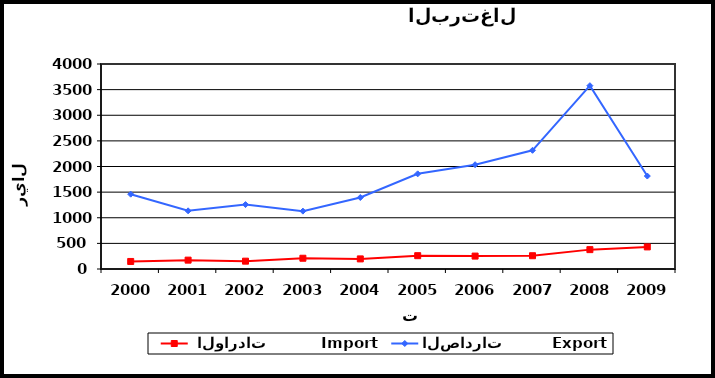
| Category |  الواردات           Import | الصادرات          Export |
|---|---|---|
| 2000.0 | 147 | 1460 |
| 2001.0 | 173 | 1135 |
| 2002.0 | 153 | 1257 |
| 2003.0 | 210 | 1129 |
| 2004.0 | 197 | 1395 |
| 2005.0 | 260 | 1857 |
| 2006.0 | 252 | 2035 |
| 2007.0 | 259 | 2316 |
| 2008.0 | 378 | 3577 |
| 2009.0 | 431 | 1814 |